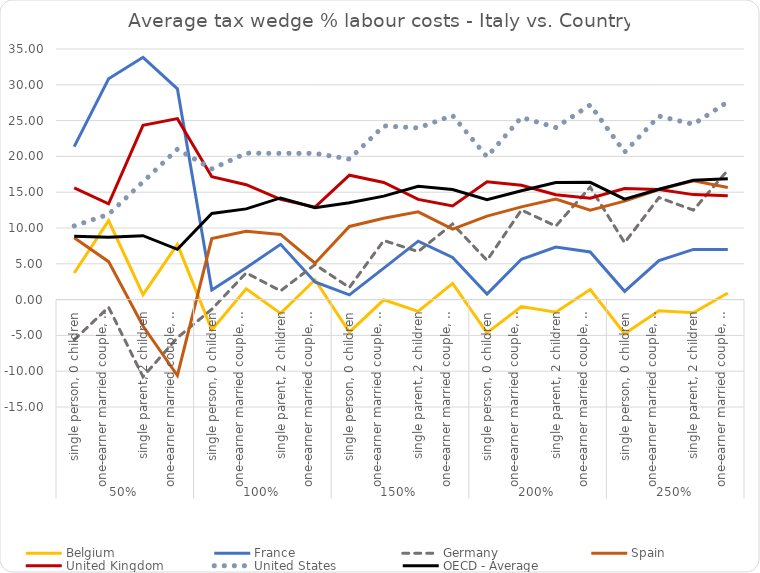
| Category | Belgium | France | Germany | Spain | United Kingdom | United States | OECD - Average |
|---|---|---|---|---|---|---|---|
| 0 | 3.709 | 21.372 | -5.62 | 8.644 | 15.589 | 10.291 | 8.847 |
| 1 | 11.027 | 30.843 | -1.064 | 5.301 | 13.381 | 11.911 | 8.704 |
| 2 | 0.693 | 33.843 | -10.778 | -3.694 | 24.337 | 16.437 | 8.927 |
| 3 | 7.714 | 29.442 | -5.324 | -10.599 | 25.278 | 21.011 | 7.019 |
| 4 | -4.231 | 1.344 | -1.341 | 8.525 | 17.154 | 18.255 | 12.04 |
| 5 | 1.508 | 4.438 | 3.73 | 9.555 | 16.047 | 20.455 | 12.668 |
| 6 | -1.925 | 7.717 | 1.22 | 9.102 | 14.014 | 20.425 | 14.198 |
| 7 | 2.771 | 2.467 | 4.889 | 5.077 | 12.907 | 20.424 | 12.844 |
| 8 | -4.55 | 0.655 | 1.696 | 10.217 | 17.378 | 19.621 | 13.516 |
| 9 | -0.032 | 4.388 | 8.252 | 11.372 | 16.352 | 24.259 | 14.451 |
| 10 | -1.647 | 8.164 | 6.706 | 12.249 | 14 | 23.975 | 15.839 |
| 11 | 2.274 | 5.882 | 10.563 | 9.85 | 13.071 | 25.709 | 15.365 |
| 12 | -4.655 | 0.772 | 5.481 | 11.656 | 16.447 | 19.942 | 13.937 |
| 13 | -0.973 | 5.639 | 12.514 | 12.956 | 15.971 | 25.447 | 15.207 |
| 14 | -1.753 | 7.337 | 10.272 | 14.046 | 14.638 | 24.036 | 16.359 |
| 15 | 1.409 | 6.662 | 15.714 | 12.501 | 14.162 | 27.19 | 16.382 |
| 16 | -4.752 | 1.162 | 7.95 | 13.755 | 15.516 | 20.596 | 14.024 |
| 17 | -1.572 | 5.457 | 14.249 | 15.381 | 15.369 | 25.629 | 15.411 |
| 18 | -1.838 | 7.006 | 12.499 | 16.59 | 14.662 | 24.486 | 16.675 |
| 19 | 0.926 | 6.988 | 18.082 | 15.658 | 14.515 | 27.628 | 16.88 |